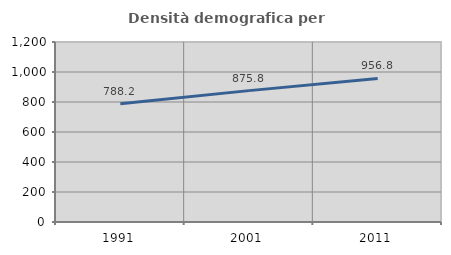
| Category | Densità demografica |
|---|---|
| 1991.0 | 788.173 |
| 2001.0 | 875.838 |
| 2011.0 | 956.751 |